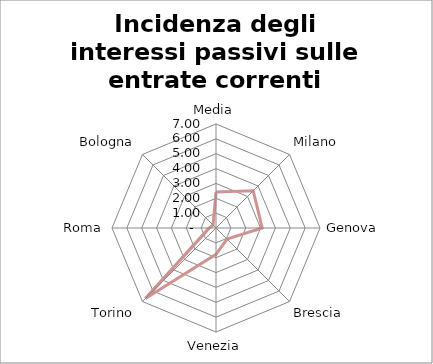
| Category | Incidenza degli interessi passivi sulle entrate correnti |
|---|---|
| Media | 2.419 |
| Milano | 3.54 |
| Genova | 3.11 |
| Brescia | 1.05 |
| Venezia | 1.77 |
| Torino | 6.72 |
| Roma | 0.46 |
| Bologna | 0.28 |